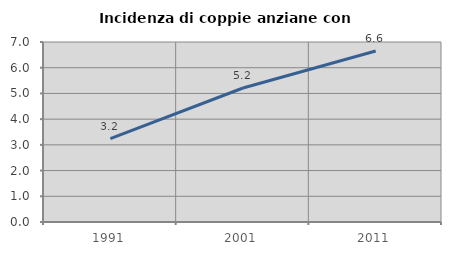
| Category | Incidenza di coppie anziane con figli |
|---|---|
| 1991.0 | 3.242 |
| 2001.0 | 5.211 |
| 2011.0 | 6.649 |